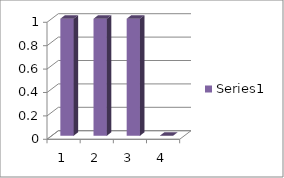
| Category | Series 0 |
|---|---|
| 0 | 1 |
| 1 | 1 |
| 2 | 1 |
| 3 | 0 |